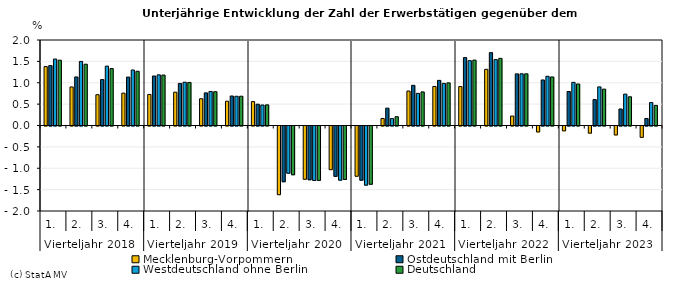
| Category | Mecklenburg-Vorpommern | Ostdeutschland mit Berlin | Westdeutschland ohne Berlin | Deutschland |
|---|---|---|---|---|
| 0 | 1.378 | 1.402 | 1.555 | 1.528 |
| 1 | 0.902 | 1.136 | 1.499 | 1.434 |
| 2 | 0.721 | 1.074 | 1.389 | 1.332 |
| 3 | 0.757 | 1.133 | 1.298 | 1.269 |
| 4 | 0.726 | 1.158 | 1.185 | 1.18 |
| 5 | 0.779 | 0.984 | 1.012 | 1.007 |
| 6 | 0.626 | 0.763 | 0.797 | 0.791 |
| 7 | 0.568 | 0.69 | 0.684 | 0.685 |
| 8 | 0.559 | 0.498 | 0.48 | 0.483 |
| 9 | -1.607 | -1.304 | -1.105 | -1.141 |
| 10 | -1.246 | -1.257 | -1.274 | -1.271 |
| 11 | -1.021 | -1.178 | -1.267 | -1.251 |
| 12 | -1.176 | -1.268 | -1.383 | -1.363 |
| 13 | 0.165 | 0.406 | 0.162 | 0.206 |
| 14 | 0.806 | 0.94 | 0.752 | 0.786 |
| 15 | 0.913 | 1.056 | 0.985 | 0.998 |
| 16 | 0.91 | 1.589 | 1.517 | 1.53 |
| 17 | 1.314 | 1.704 | 1.542 | 1.571 |
| 18 | 0.221 | 1.207 | 1.209 | 1.209 |
| 19 | -0.139 | 1.065 | 1.151 | 1.135 |
| 20 | -0.113 | 0.795 | 1.01 | 0.971 |
| 21 | -0.167 | 0.606 | 0.903 | 0.85 |
| 22 | -0.21 | 0.386 | 0.734 | 0.672 |
| 23 | -0.266 | 0.164 | 0.537 | 0.47 |